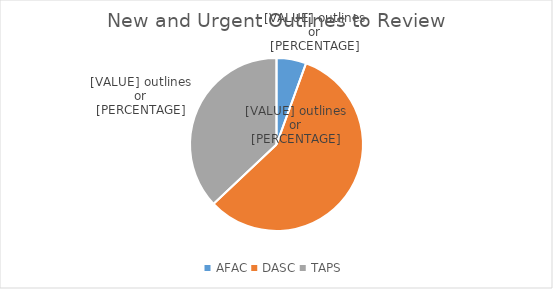
| Category | Series 0 |
|---|---|
| AFAC | 3 |
| DASC | 31 |
| TAPS | 20 |